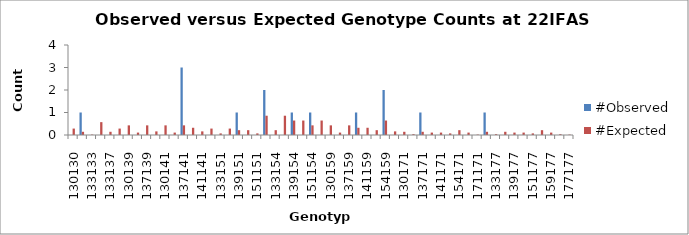
| Category | #Observed | #Expected |
|---|---|---|
| 130130.0 | 0 | 0.286 |
| 130133.0 | 1 | 0.143 |
| 133133.0 | 0 | 0.018 |
| 130137.0 | 0 | 0.571 |
| 133137.0 | 0 | 0.143 |
| 137137.0 | 0 | 0.286 |
| 130139.0 | 0 | 0.429 |
| 133139.0 | 0 | 0.107 |
| 137139.0 | 0 | 0.429 |
| 139139.0 | 0 | 0.161 |
| 130141.0 | 0 | 0.429 |
| 133141.0 | 0 | 0.107 |
| 137141.0 | 3 | 0.429 |
| 139141.0 | 0 | 0.321 |
| 141141.0 | 0 | 0.161 |
| 130151.0 | 0 | 0.286 |
| 133151.0 | 0 | 0.071 |
| 137151.0 | 0 | 0.286 |
| 139151.0 | 1 | 0.214 |
| 141151.0 | 0 | 0.214 |
| 151151.0 | 0 | 0.071 |
| 130154.0 | 2 | 0.857 |
| 133154.0 | 0 | 0.214 |
| 137154.0 | 0 | 0.857 |
| 139154.0 | 1 | 0.643 |
| 141154.0 | 0 | 0.643 |
| 151154.0 | 1 | 0.429 |
| 154154.0 | 0 | 0.643 |
| 130159.0 | 0 | 0.429 |
| 133159.0 | 0 | 0.107 |
| 137159.0 | 0 | 0.429 |
| 139159.0 | 1 | 0.321 |
| 141159.0 | 0 | 0.321 |
| 151159.0 | 0 | 0.214 |
| 154159.0 | 2 | 0.643 |
| 159159.0 | 0 | 0.161 |
| 130171.0 | 0 | 0.143 |
| 133171.0 | 0 | 0.036 |
| 137171.0 | 1 | 0.143 |
| 139171.0 | 0 | 0.107 |
| 141171.0 | 0 | 0.107 |
| 151171.0 | 0 | 0.071 |
| 154171.0 | 0 | 0.214 |
| 159171.0 | 0 | 0.107 |
| 171171.0 | 0 | 0.018 |
| 130177.0 | 1 | 0.143 |
| 133177.0 | 0 | 0.036 |
| 137177.0 | 0 | 0.143 |
| 139177.0 | 0 | 0.107 |
| 141177.0 | 0 | 0.107 |
| 151177.0 | 0 | 0.071 |
| 154177.0 | 0 | 0.214 |
| 159177.0 | 0 | 0.107 |
| 171177.0 | 0 | 0.036 |
| 177177.0 | 0 | 0.018 |